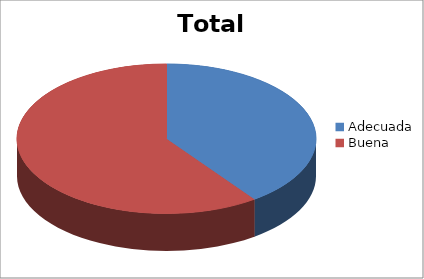
| Category | Total |
|---|---|
| Adecuada | 0.4 |
| Buena | 0.6 |